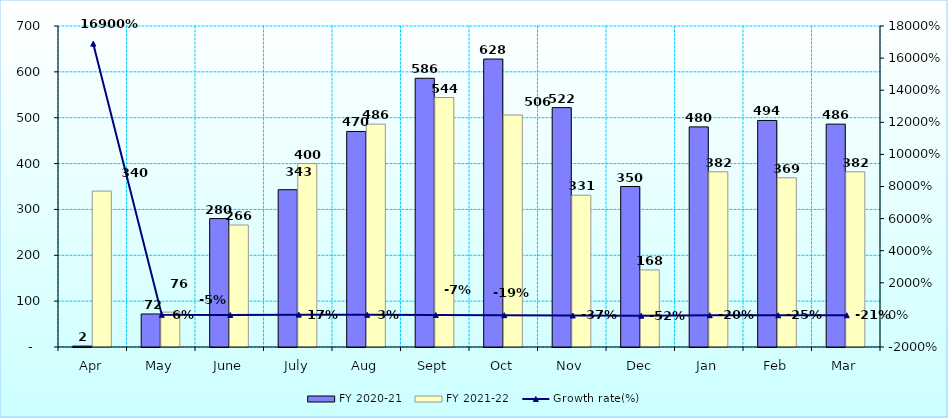
| Category | FY 2020-21 | FY 2021-22 |
|---|---|---|
| Apr | 2 | 340 |
| May | 72 | 76 |
| June | 280 | 266 |
| July | 343 | 400 |
| Aug | 470 | 486 |
| Sept | 586 | 544 |
| Oct | 628 | 506 |
| Nov | 522 | 331 |
| Dec | 350 | 168 |
| Jan | 480 | 382 |
| Feb | 494 | 369 |
| Mar | 486 | 382 |